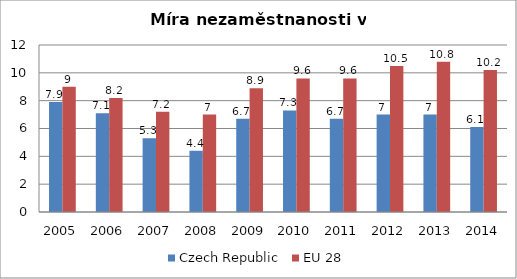
| Category | Czech Republic | EU 28 |
|---|---|---|
| 2005 | 7.9 | 9 |
| 2006 | 7.1 | 8.2 |
| 2007 | 5.3 | 7.2 |
| 2008 | 4.4 | 7 |
| 2009 | 6.7 | 8.9 |
| 2010 | 7.3 | 9.6 |
| 2011 | 6.7 | 9.6 |
| 2012 | 7 | 10.5 |
| 2013 | 7 | 10.8 |
| 2014 | 6.1 | 10.2 |